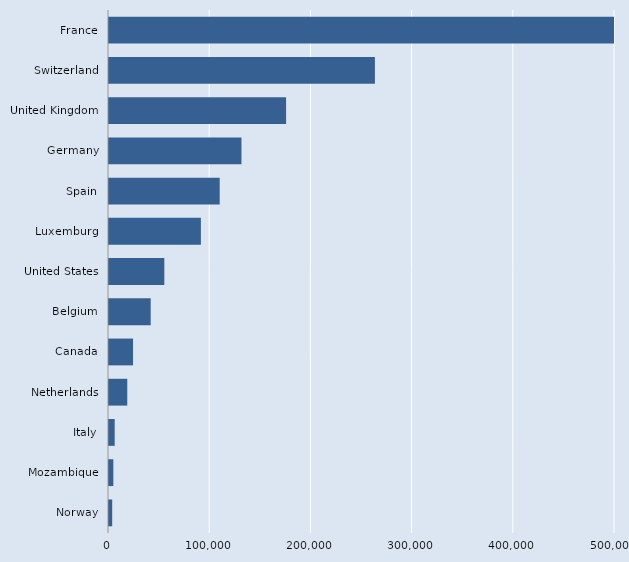
| Category | Series 0 |
|---|---|
| Norway | 3161 |
| Mozambique | 4279 |
| Italy | 5614 |
| Netherlands | 18060 |
| Canada | 23765 |
| Belgium | 41200 |
| United States | 54669 |
| Luxemburg | 90800 |
| Spain | 109390 |
| Germany | 130882 |
| United Kingdom | 175000 |
| Switzerland | 262748 |
| France | 509254 |